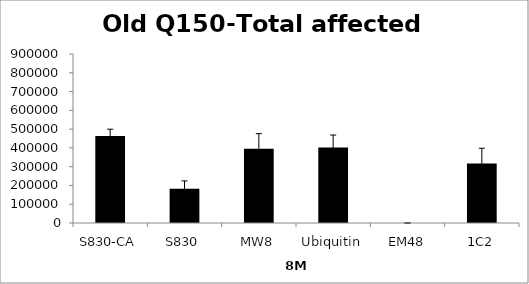
| Category | Series 0 |
|---|---|
| S830-CA | 463661.437 |
| S830 | 182389.794 |
| MW8 | 395502.435 |
| Ubiquitin | 402698.598 |
| EM48 | 0 |
| 1C2 | 316528.981 |